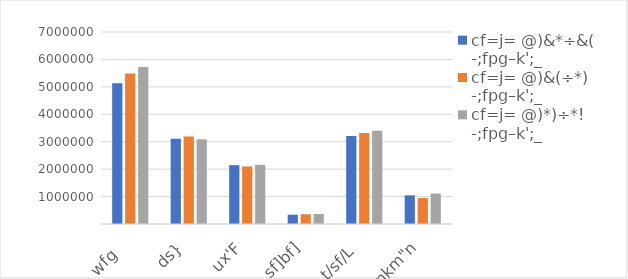
| Category | cf=j= @)&*÷&(  -;fpg–k';_         | cf=j= @)&(÷*)
-;fpg–k';_         | cf=j= @)*)÷*!
-;fpg–k';_         |
|---|---|---|---|
|     wfg   | 5130627.455 | 5486474.418 | 5724234.606 |
|     ds} | 3106397.633 | 3193170.301 | 3089560.623 |
|     ux'F | 2144566.626 | 2098563.649 | 2155667.84 |
|     sf]bf] | 339461.52 | 355757.203 | 365210.75 |
| t/sf/L  | 3209971.63 | 3313684.88 | 3396139.28 |
| kmnkm"n | 1045163.82 | 948565.8 | 1109973.34 |